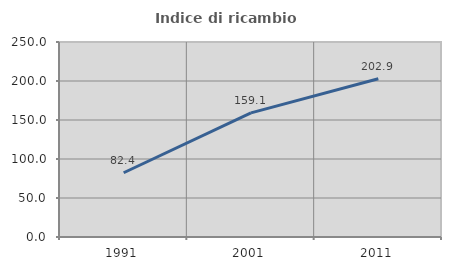
| Category | Indice di ricambio occupazionale  |
|---|---|
| 1991.0 | 82.353 |
| 2001.0 | 159.091 |
| 2011.0 | 202.857 |